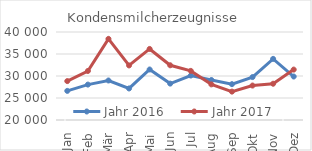
| Category | Jahr 2016 | Jahr 2017 |
|---|---|---|
| Jan | 26617.603 | 28844.686 |
| Feb | 28049.419 | 31138.826 |
| Mär | 28980.855 | 38437.743 |
| Apr | 27165.803 | 32402.077 |
| Mai | 31477.475 | 36147.038 |
| Jun | 28272.226 | 32436.408 |
| Jul | 30103.965 | 31164.158 |
| Aug | 29090.904 | 28096.875 |
| Sep | 28147.794 | 26450.844 |
| Okt | 29755.065 | 27830.835 |
| Nov | 33890.629 | 28242.881 |
| Dez | 29880.169 | 31459.815 |